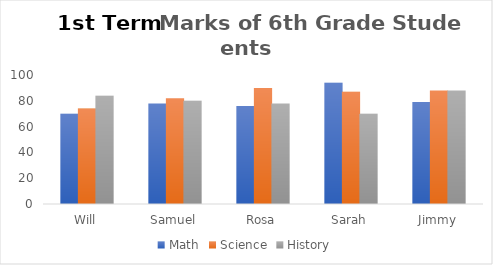
| Category | Math | Science | History |
|---|---|---|---|
| Will | 70 | 74 | 84 |
| Samuel | 78 | 82 | 80 |
| Rosa | 76 | 90 | 78 |
| Sarah | 94 | 87 | 70 |
| Jimmy | 79 | 88 | 88 |